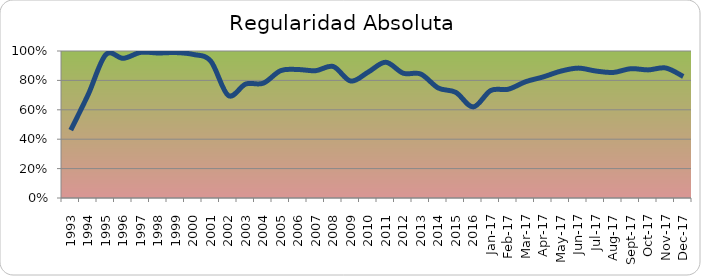
| Category | Series 0 |
|---|---|
| 1993.0 | 0.462 |
| 1994.0 | 0.705 |
| 1995.0 | 0.975 |
| 1996.0 | 0.95 |
| 1997.0 | 0.991 |
| 1998.0 | 0.986 |
| 1999.0 | 0.989 |
| 2000.0 | 0.977 |
| 2001.0 | 0.931 |
| 2002.0 | 0.697 |
| 2003.0 | 0.775 |
| 2004.0 | 0.781 |
| 2005.0 | 0.867 |
| 2006.0 | 0.874 |
| 2007.0 | 0.866 |
| 2008.0 | 0.894 |
| 2009.0 | 0.795 |
| 2010.0 | 0.857 |
| 2011.0 | 0.924 |
| 2012.0 | 0.849 |
| 2013.0 | 0.843 |
| 2014.0 | 0.748 |
| 2015.0 | 0.719 |
| 2016.0 | 0.62 |
| 42736.0 | 0.731 |
| 42767.0 | 0.74 |
| 42795.0 | 0.791 |
| 42826.0 | 0.824 |
| 42856.0 | 0.863 |
| 42887.0 | 0.884 |
| 42917.0 | 0.864 |
| 42948.0 | 0.854 |
| 42979.0 | 0.88 |
| 43009.0 | 0.872 |
| 43040.0 | 0.884 |
| 43070.0 | 0.827 |